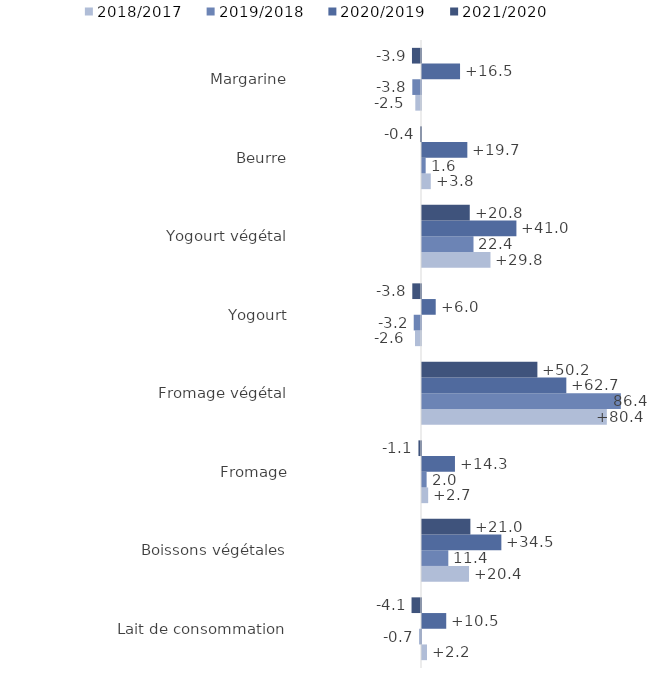
| Category | 2018/2017 | 2019/2018 | 2020/2019 | 2021/2020 |
|---|---|---|---|---|
| Lait de consommation | 2.164 | -0.687 | 10.537 | -4.114 |
| Boissons végétales | 20.445 | 11.443 | 34.506 | 21.036 |
| Fromage | 2.682 | 2.01 | 14.33 | -1.113 |
| Fromage végétal | 80.364 | 86.45 | 62.75 | 50.168 |
| Yogourt | -2.602 | -3.164 | 5.965 | -3.786 |
| Yogourt végétal | 29.773 | 22.391 | 41.049 | 20.762 |
| Beurre | 3.815 | 1.594 | 19.711 | -0.439 |
| Margarine | -2.473 | -3.778 | 16.541 | -3.929 |